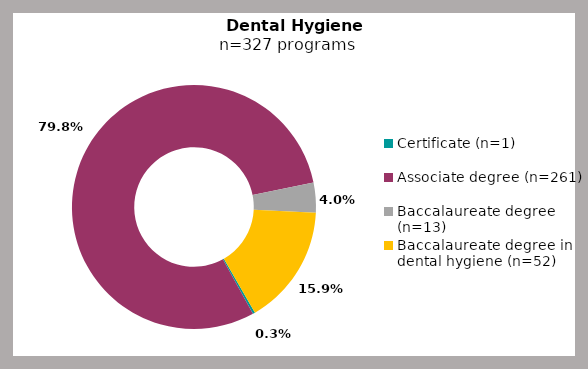
| Category | Series 0 |
|---|---|
| Certificate (n=1) | 0.003 |
| Associate degree (n=261) | 0.798 |
| Baccalaureate degree (n=13) | 0.04 |
| Baccalaureate degree in dental hygiene (n=52) | 0.159 |